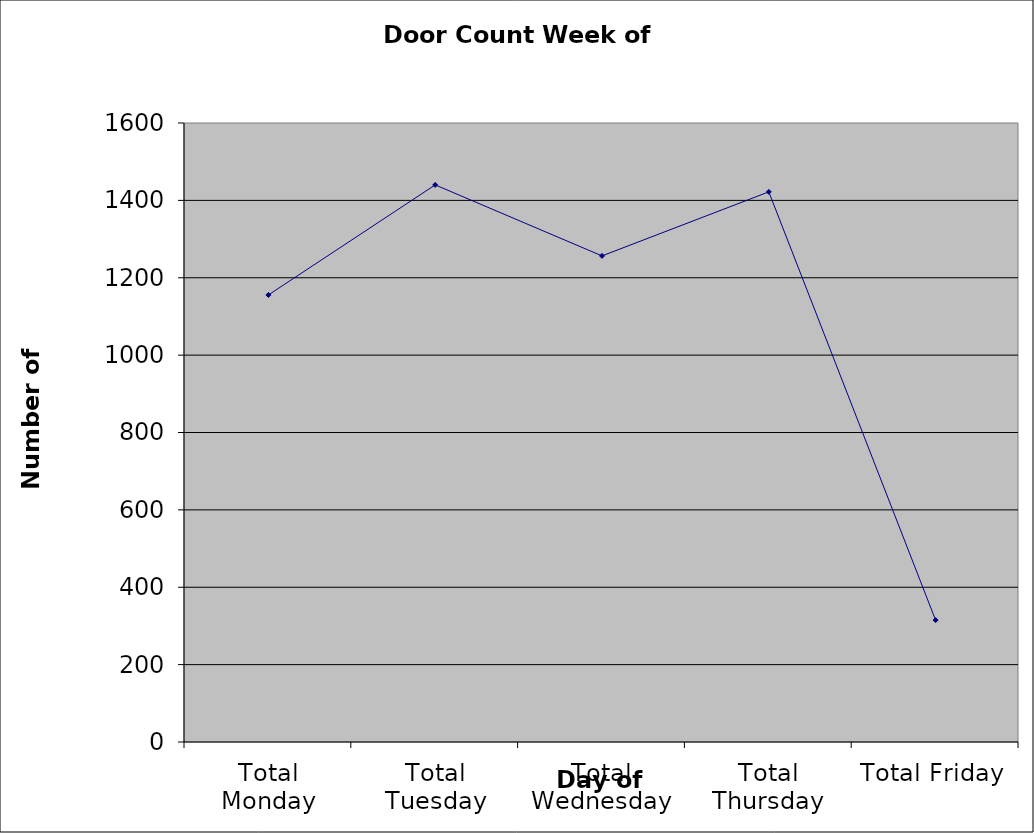
| Category | Series 0 |
|---|---|
| Total Monday | 1155.5 |
| Total Tuesday | 1440 |
| Total Wednesday | 1256.5 |
| Total Thursday | 1422 |
| Total Friday | 315 |